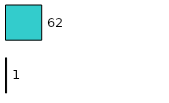
| Category | Series 0 | Series 1 |
|---|---|---|
| 0 | 1 | 62 |